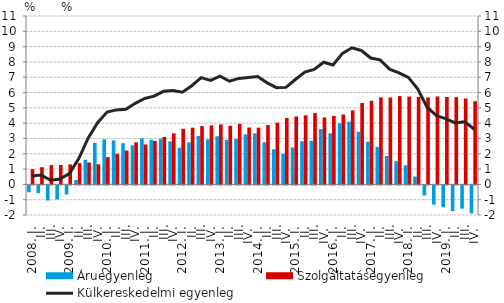
| Category | Áruegyenleg | Szolgáltatásegyenleg |
|---|---|---|
| 2008. I. | -0.45 | 0.991 |
|          II. | -0.517 | 1.126 |
|          III. | -0.987 | 1.26 |
|          IV. | -0.919 | 1.265 |
| 2009. I. | -0.594 | 1.303 |
|          II. | 0.29 | 1.392 |
|          III. | 1.61 | 1.429 |
|          IV. | 2.713 | 1.313 |
| 2010. I. | 2.948 | 1.778 |
|          II. | 2.87 | 1.996 |
|          III. | 2.691 | 2.211 |
|          IV. | 2.548 | 2.749 |
| 2011. I. | 3.006 | 2.608 |
|          II. | 2.919 | 2.842 |
|          III. | 2.981 | 3.098 |
|          IV. | 2.803 | 3.33 |
| 2012. I. | 2.395 | 3.628 |
|          II. | 2.741 | 3.704 |
|          III. | 3.17 | 3.807 |
|          IV. | 2.94 | 3.853 |
| 2013. I. | 3.144 | 3.922 |
| II. | 2.906 | 3.832 |
|          III. | 2.969 | 3.955 |
| IV. | 3.266 | 3.718 |
| 2014. I. | 3.337 | 3.706 |
| II. | 2.755 | 3.877 |
|          III. | 2.292 | 4.027 |
| IV. | 2.006 | 4.331 |
| 2015. I. | 2.414 | 4.438 |
| II. | 2.816 | 4.514 |
|          III. | 2.851 | 4.654 |
| IV. | 3.61 | 4.372 |
| 2016. I. | 3.333 | 4.466 |
| II. | 3.991 | 4.564 |
|          III. | 4.093 | 4.832 |
| IV. | 3.434 | 5.315 |
| 2017. I. | 2.793 | 5.463 |
| II. | 2.448 | 5.688 |
|          III. | 1.853 | 5.675 |
| IV. | 1.52 | 5.77 |
| 2018. I. | 1.254 | 5.735 |
| II. | 0.508 | 5.721 |
|          III. | -0.656 | 5.68 |
| IV. | -1.261 | 5.746 |
| 2019. I. | -1.428 | 5.709 |
| II. | -1.682 | 5.702 |
|          III. | -1.518 | 5.612 |
| IV. | -1.83 | 5.434 |